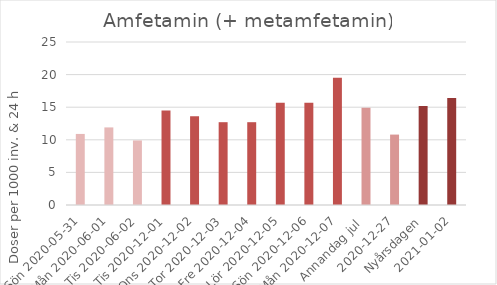
| Category | Amfetamin (+ metamfetamin) |
|---|---|
| Sön 2020-05-31 | 10.9 |
| Mån 2020-06-01 | 11.9 |
|  Tis 2020-06-02 | 9.9 |
| Tis 2020-12-01 | 14.5 |
| Ons 2020-12-02 | 13.6 |
| Tor 2020-12-03 | 12.7 |
| Fre 2020-12-04 | 12.7 |
| Lör 2020-12-05 | 15.7 |
| Sön 2020-12-06 | 15.7 |
| Mån 2020-12-07 | 19.5 |
| Annandag jul  | 14.9 |
| 2020-12-27 | 10.8 |
| Nyårsdagen | 15.2 |
| 2021-01-02 | 16.4 |